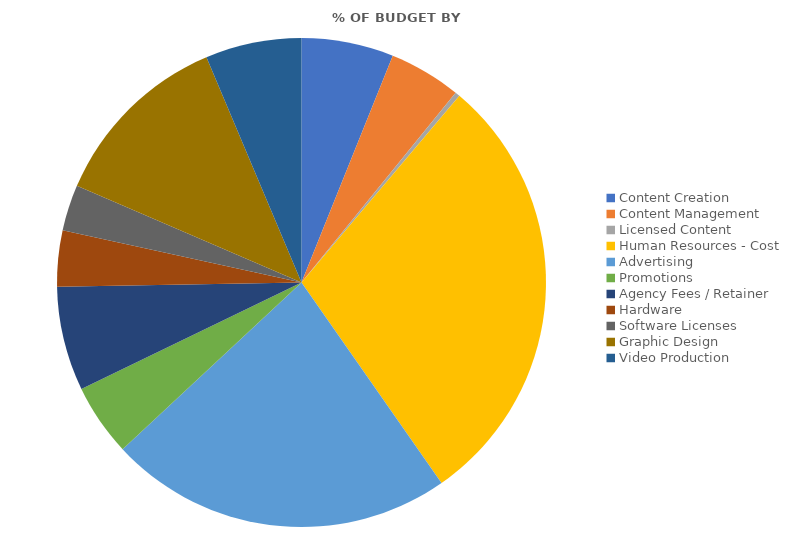
| Category | Series 0 | Series 1 |
|---|---|---|
| Content Creation | 23000 | 0.061 |
| Content Management | 18000 | 0.048 |
| Licensed Content | 1200 | 0.003 |
| Human Resources - Cost | 110000 | 0.291 |
| Advertising | 86000 | 0.228 |
| Promotions | 18000 | 0.048 |
| Agency Fees / Retainer | 26000 | 0.069 |
| Hardware | 14000 | 0.037 |
| Software Licenses | 11500 | 0.03 |
| Graphic Design | 46000 | 0.122 |
| Video Production | 24000 | 0.064 |